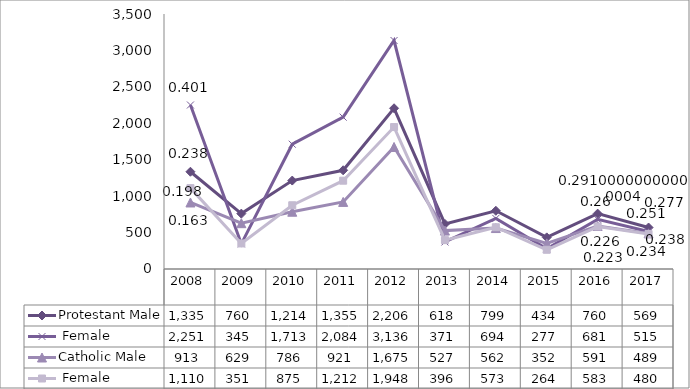
| Category | Protestant | Catholic |
|---|---|---|
| 2008.0 | 2251 | 1110 |
| 2009.0 | 345 | 351 |
| 2010.0 | 1713 | 875 |
| 2011.0 | 2084 | 1212 |
| 2012.0 | 3136 | 1948 |
| 2013.0 | 371 | 396 |
| 2014.0 | 694 | 573 |
| 2015.0 | 277 | 264 |
| 2016.0 | 681 | 583 |
| 2017.0 | 515 | 480 |